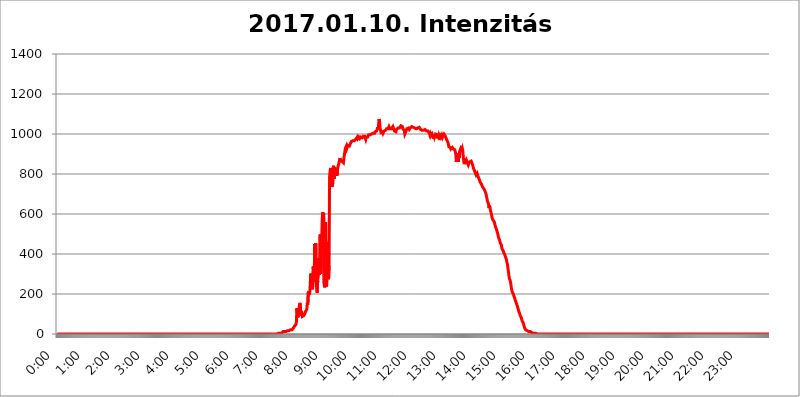
| Category | 2017.01.10. Intenzitás [W/m^2] |
|---|---|
| 0.0 | 0 |
| 0.0006944444444444445 | 0 |
| 0.001388888888888889 | 0 |
| 0.0020833333333333333 | 0 |
| 0.002777777777777778 | 0 |
| 0.003472222222222222 | 0 |
| 0.004166666666666667 | 0 |
| 0.004861111111111111 | 0 |
| 0.005555555555555556 | 0 |
| 0.0062499999999999995 | 0 |
| 0.006944444444444444 | 0 |
| 0.007638888888888889 | 0 |
| 0.008333333333333333 | 0 |
| 0.009027777777777779 | 0 |
| 0.009722222222222222 | 0 |
| 0.010416666666666666 | 0 |
| 0.011111111111111112 | 0 |
| 0.011805555555555555 | 0 |
| 0.012499999999999999 | 0 |
| 0.013194444444444444 | 0 |
| 0.013888888888888888 | 0 |
| 0.014583333333333332 | 0 |
| 0.015277777777777777 | 0 |
| 0.015972222222222224 | 0 |
| 0.016666666666666666 | 0 |
| 0.017361111111111112 | 0 |
| 0.018055555555555557 | 0 |
| 0.01875 | 0 |
| 0.019444444444444445 | 0 |
| 0.02013888888888889 | 0 |
| 0.020833333333333332 | 0 |
| 0.02152777777777778 | 0 |
| 0.022222222222222223 | 0 |
| 0.02291666666666667 | 0 |
| 0.02361111111111111 | 0 |
| 0.024305555555555556 | 0 |
| 0.024999999999999998 | 0 |
| 0.025694444444444447 | 0 |
| 0.02638888888888889 | 0 |
| 0.027083333333333334 | 0 |
| 0.027777777777777776 | 0 |
| 0.02847222222222222 | 0 |
| 0.029166666666666664 | 0 |
| 0.029861111111111113 | 0 |
| 0.030555555555555555 | 0 |
| 0.03125 | 0 |
| 0.03194444444444445 | 0 |
| 0.03263888888888889 | 0 |
| 0.03333333333333333 | 0 |
| 0.034027777777777775 | 0 |
| 0.034722222222222224 | 0 |
| 0.035416666666666666 | 0 |
| 0.036111111111111115 | 0 |
| 0.03680555555555556 | 0 |
| 0.0375 | 0 |
| 0.03819444444444444 | 0 |
| 0.03888888888888889 | 0 |
| 0.03958333333333333 | 0 |
| 0.04027777777777778 | 0 |
| 0.04097222222222222 | 0 |
| 0.041666666666666664 | 0 |
| 0.042361111111111106 | 0 |
| 0.04305555555555556 | 0 |
| 0.043750000000000004 | 0 |
| 0.044444444444444446 | 0 |
| 0.04513888888888889 | 0 |
| 0.04583333333333334 | 0 |
| 0.04652777777777778 | 0 |
| 0.04722222222222222 | 0 |
| 0.04791666666666666 | 0 |
| 0.04861111111111111 | 0 |
| 0.049305555555555554 | 0 |
| 0.049999999999999996 | 0 |
| 0.05069444444444445 | 0 |
| 0.051388888888888894 | 0 |
| 0.052083333333333336 | 0 |
| 0.05277777777777778 | 0 |
| 0.05347222222222222 | 0 |
| 0.05416666666666667 | 0 |
| 0.05486111111111111 | 0 |
| 0.05555555555555555 | 0 |
| 0.05625 | 0 |
| 0.05694444444444444 | 0 |
| 0.057638888888888885 | 0 |
| 0.05833333333333333 | 0 |
| 0.05902777777777778 | 0 |
| 0.059722222222222225 | 0 |
| 0.06041666666666667 | 0 |
| 0.061111111111111116 | 0 |
| 0.06180555555555556 | 0 |
| 0.0625 | 0 |
| 0.06319444444444444 | 0 |
| 0.06388888888888888 | 0 |
| 0.06458333333333334 | 0 |
| 0.06527777777777778 | 0 |
| 0.06597222222222222 | 0 |
| 0.06666666666666667 | 0 |
| 0.06736111111111111 | 0 |
| 0.06805555555555555 | 0 |
| 0.06874999999999999 | 0 |
| 0.06944444444444443 | 0 |
| 0.07013888888888889 | 0 |
| 0.07083333333333333 | 0 |
| 0.07152777777777779 | 0 |
| 0.07222222222222223 | 0 |
| 0.07291666666666667 | 0 |
| 0.07361111111111111 | 0 |
| 0.07430555555555556 | 0 |
| 0.075 | 0 |
| 0.07569444444444444 | 0 |
| 0.0763888888888889 | 0 |
| 0.07708333333333334 | 0 |
| 0.07777777777777778 | 0 |
| 0.07847222222222222 | 0 |
| 0.07916666666666666 | 0 |
| 0.0798611111111111 | 0 |
| 0.08055555555555556 | 0 |
| 0.08125 | 0 |
| 0.08194444444444444 | 0 |
| 0.08263888888888889 | 0 |
| 0.08333333333333333 | 0 |
| 0.08402777777777777 | 0 |
| 0.08472222222222221 | 0 |
| 0.08541666666666665 | 0 |
| 0.08611111111111112 | 0 |
| 0.08680555555555557 | 0 |
| 0.08750000000000001 | 0 |
| 0.08819444444444445 | 0 |
| 0.08888888888888889 | 0 |
| 0.08958333333333333 | 0 |
| 0.09027777777777778 | 0 |
| 0.09097222222222222 | 0 |
| 0.09166666666666667 | 0 |
| 0.09236111111111112 | 0 |
| 0.09305555555555556 | 0 |
| 0.09375 | 0 |
| 0.09444444444444444 | 0 |
| 0.09513888888888888 | 0 |
| 0.09583333333333333 | 0 |
| 0.09652777777777777 | 0 |
| 0.09722222222222222 | 0 |
| 0.09791666666666667 | 0 |
| 0.09861111111111111 | 0 |
| 0.09930555555555555 | 0 |
| 0.09999999999999999 | 0 |
| 0.10069444444444443 | 0 |
| 0.1013888888888889 | 0 |
| 0.10208333333333335 | 0 |
| 0.10277777777777779 | 0 |
| 0.10347222222222223 | 0 |
| 0.10416666666666667 | 0 |
| 0.10486111111111111 | 0 |
| 0.10555555555555556 | 0 |
| 0.10625 | 0 |
| 0.10694444444444444 | 0 |
| 0.1076388888888889 | 0 |
| 0.10833333333333334 | 0 |
| 0.10902777777777778 | 0 |
| 0.10972222222222222 | 0 |
| 0.1111111111111111 | 0 |
| 0.11180555555555556 | 0 |
| 0.11180555555555556 | 0 |
| 0.1125 | 0 |
| 0.11319444444444444 | 0 |
| 0.11388888888888889 | 0 |
| 0.11458333333333333 | 0 |
| 0.11527777777777777 | 0 |
| 0.11597222222222221 | 0 |
| 0.11666666666666665 | 0 |
| 0.1173611111111111 | 0 |
| 0.11805555555555557 | 0 |
| 0.11944444444444445 | 0 |
| 0.12013888888888889 | 0 |
| 0.12083333333333333 | 0 |
| 0.12152777777777778 | 0 |
| 0.12222222222222223 | 0 |
| 0.12291666666666667 | 0 |
| 0.12291666666666667 | 0 |
| 0.12361111111111112 | 0 |
| 0.12430555555555556 | 0 |
| 0.125 | 0 |
| 0.12569444444444444 | 0 |
| 0.12638888888888888 | 0 |
| 0.12708333333333333 | 0 |
| 0.16875 | 0 |
| 0.12847222222222224 | 0 |
| 0.12916666666666668 | 0 |
| 0.12986111111111112 | 0 |
| 0.13055555555555556 | 0 |
| 0.13125 | 0 |
| 0.13194444444444445 | 0 |
| 0.1326388888888889 | 0 |
| 0.13333333333333333 | 0 |
| 0.13402777777777777 | 0 |
| 0.13402777777777777 | 0 |
| 0.13472222222222222 | 0 |
| 0.13541666666666666 | 0 |
| 0.1361111111111111 | 0 |
| 0.13749999999999998 | 0 |
| 0.13819444444444443 | 0 |
| 0.1388888888888889 | 0 |
| 0.13958333333333334 | 0 |
| 0.14027777777777778 | 0 |
| 0.14097222222222222 | 0 |
| 0.14166666666666666 | 0 |
| 0.1423611111111111 | 0 |
| 0.14305555555555557 | 0 |
| 0.14375000000000002 | 0 |
| 0.14444444444444446 | 0 |
| 0.1451388888888889 | 0 |
| 0.1451388888888889 | 0 |
| 0.14652777777777778 | 0 |
| 0.14722222222222223 | 0 |
| 0.14791666666666667 | 0 |
| 0.1486111111111111 | 0 |
| 0.14930555555555555 | 0 |
| 0.15 | 0 |
| 0.15069444444444444 | 0 |
| 0.15138888888888888 | 0 |
| 0.15208333333333332 | 0 |
| 0.15277777777777776 | 0 |
| 0.15347222222222223 | 0 |
| 0.15416666666666667 | 0 |
| 0.15486111111111112 | 0 |
| 0.15555555555555556 | 0 |
| 0.15625 | 0 |
| 0.15694444444444444 | 0 |
| 0.15763888888888888 | 0 |
| 0.15833333333333333 | 0 |
| 0.15902777777777777 | 0 |
| 0.15972222222222224 | 0 |
| 0.16041666666666668 | 0 |
| 0.16111111111111112 | 0 |
| 0.16180555555555556 | 0 |
| 0.1625 | 0 |
| 0.16319444444444445 | 0 |
| 0.1638888888888889 | 0 |
| 0.16458333333333333 | 0 |
| 0.16527777777777777 | 0 |
| 0.16597222222222222 | 0 |
| 0.16666666666666666 | 0 |
| 0.1673611111111111 | 0 |
| 0.16805555555555554 | 0 |
| 0.16874999999999998 | 0 |
| 0.16944444444444443 | 0 |
| 0.17013888888888887 | 0 |
| 0.1708333333333333 | 0 |
| 0.17152777777777775 | 0 |
| 0.17222222222222225 | 0 |
| 0.1729166666666667 | 0 |
| 0.17361111111111113 | 0 |
| 0.17430555555555557 | 0 |
| 0.17500000000000002 | 0 |
| 0.17569444444444446 | 0 |
| 0.1763888888888889 | 0 |
| 0.17708333333333334 | 0 |
| 0.17777777777777778 | 0 |
| 0.17847222222222223 | 0 |
| 0.17916666666666667 | 0 |
| 0.1798611111111111 | 0 |
| 0.18055555555555555 | 0 |
| 0.18125 | 0 |
| 0.18194444444444444 | 0 |
| 0.1826388888888889 | 0 |
| 0.18333333333333335 | 0 |
| 0.1840277777777778 | 0 |
| 0.18472222222222223 | 0 |
| 0.18541666666666667 | 0 |
| 0.18611111111111112 | 0 |
| 0.18680555555555556 | 0 |
| 0.1875 | 0 |
| 0.18819444444444444 | 0 |
| 0.18888888888888888 | 0 |
| 0.18958333333333333 | 0 |
| 0.19027777777777777 | 0 |
| 0.1909722222222222 | 0 |
| 0.19166666666666665 | 0 |
| 0.19236111111111112 | 0 |
| 0.19305555555555554 | 0 |
| 0.19375 | 0 |
| 0.19444444444444445 | 0 |
| 0.1951388888888889 | 0 |
| 0.19583333333333333 | 0 |
| 0.19652777777777777 | 0 |
| 0.19722222222222222 | 0 |
| 0.19791666666666666 | 0 |
| 0.1986111111111111 | 0 |
| 0.19930555555555554 | 0 |
| 0.19999999999999998 | 0 |
| 0.20069444444444443 | 0 |
| 0.20138888888888887 | 0 |
| 0.2020833333333333 | 0 |
| 0.2027777777777778 | 0 |
| 0.2034722222222222 | 0 |
| 0.2041666666666667 | 0 |
| 0.20486111111111113 | 0 |
| 0.20555555555555557 | 0 |
| 0.20625000000000002 | 0 |
| 0.20694444444444446 | 0 |
| 0.2076388888888889 | 0 |
| 0.20833333333333334 | 0 |
| 0.20902777777777778 | 0 |
| 0.20972222222222223 | 0 |
| 0.21041666666666667 | 0 |
| 0.2111111111111111 | 0 |
| 0.21180555555555555 | 0 |
| 0.2125 | 0 |
| 0.21319444444444444 | 0 |
| 0.2138888888888889 | 0 |
| 0.21458333333333335 | 0 |
| 0.2152777777777778 | 0 |
| 0.21597222222222223 | 0 |
| 0.21666666666666667 | 0 |
| 0.21736111111111112 | 0 |
| 0.21805555555555556 | 0 |
| 0.21875 | 0 |
| 0.21944444444444444 | 0 |
| 0.22013888888888888 | 0 |
| 0.22083333333333333 | 0 |
| 0.22152777777777777 | 0 |
| 0.2222222222222222 | 0 |
| 0.22291666666666665 | 0 |
| 0.2236111111111111 | 0 |
| 0.22430555555555556 | 0 |
| 0.225 | 0 |
| 0.22569444444444445 | 0 |
| 0.2263888888888889 | 0 |
| 0.22708333333333333 | 0 |
| 0.22777777777777777 | 0 |
| 0.22847222222222222 | 0 |
| 0.22916666666666666 | 0 |
| 0.2298611111111111 | 0 |
| 0.23055555555555554 | 0 |
| 0.23124999999999998 | 0 |
| 0.23194444444444443 | 0 |
| 0.23263888888888887 | 0 |
| 0.2333333333333333 | 0 |
| 0.2340277777777778 | 0 |
| 0.2347222222222222 | 0 |
| 0.2354166666666667 | 0 |
| 0.23611111111111113 | 0 |
| 0.23680555555555557 | 0 |
| 0.23750000000000002 | 0 |
| 0.23819444444444446 | 0 |
| 0.2388888888888889 | 0 |
| 0.23958333333333334 | 0 |
| 0.24027777777777778 | 0 |
| 0.24097222222222223 | 0 |
| 0.24166666666666667 | 0 |
| 0.2423611111111111 | 0 |
| 0.24305555555555555 | 0 |
| 0.24375 | 0 |
| 0.24444444444444446 | 0 |
| 0.24513888888888888 | 0 |
| 0.24583333333333335 | 0 |
| 0.2465277777777778 | 0 |
| 0.24722222222222223 | 0 |
| 0.24791666666666667 | 0 |
| 0.24861111111111112 | 0 |
| 0.24930555555555556 | 0 |
| 0.25 | 0 |
| 0.25069444444444444 | 0 |
| 0.2513888888888889 | 0 |
| 0.2520833333333333 | 0 |
| 0.25277777777777777 | 0 |
| 0.2534722222222222 | 0 |
| 0.25416666666666665 | 0 |
| 0.2548611111111111 | 0 |
| 0.2555555555555556 | 0 |
| 0.25625000000000003 | 0 |
| 0.2569444444444445 | 0 |
| 0.2576388888888889 | 0 |
| 0.25833333333333336 | 0 |
| 0.2590277777777778 | 0 |
| 0.25972222222222224 | 0 |
| 0.2604166666666667 | 0 |
| 0.2611111111111111 | 0 |
| 0.26180555555555557 | 0 |
| 0.2625 | 0 |
| 0.26319444444444445 | 0 |
| 0.2638888888888889 | 0 |
| 0.26458333333333334 | 0 |
| 0.2652777777777778 | 0 |
| 0.2659722222222222 | 0 |
| 0.26666666666666666 | 0 |
| 0.2673611111111111 | 0 |
| 0.26805555555555555 | 0 |
| 0.26875 | 0 |
| 0.26944444444444443 | 0 |
| 0.2701388888888889 | 0 |
| 0.2708333333333333 | 0 |
| 0.27152777777777776 | 0 |
| 0.2722222222222222 | 0 |
| 0.27291666666666664 | 0 |
| 0.2736111111111111 | 0 |
| 0.2743055555555555 | 0 |
| 0.27499999999999997 | 0 |
| 0.27569444444444446 | 0 |
| 0.27638888888888885 | 0 |
| 0.27708333333333335 | 0 |
| 0.2777777777777778 | 0 |
| 0.27847222222222223 | 0 |
| 0.2791666666666667 | 0 |
| 0.2798611111111111 | 0 |
| 0.28055555555555556 | 0 |
| 0.28125 | 0 |
| 0.28194444444444444 | 0 |
| 0.2826388888888889 | 0 |
| 0.2833333333333333 | 0 |
| 0.28402777777777777 | 0 |
| 0.2847222222222222 | 0 |
| 0.28541666666666665 | 0 |
| 0.28611111111111115 | 0 |
| 0.28680555555555554 | 0 |
| 0.28750000000000003 | 0 |
| 0.2881944444444445 | 0 |
| 0.2888888888888889 | 0 |
| 0.28958333333333336 | 0 |
| 0.2902777777777778 | 0 |
| 0.29097222222222224 | 0 |
| 0.2916666666666667 | 0 |
| 0.2923611111111111 | 0 |
| 0.29305555555555557 | 0 |
| 0.29375 | 0 |
| 0.29444444444444445 | 0 |
| 0.2951388888888889 | 0 |
| 0.29583333333333334 | 0 |
| 0.2965277777777778 | 0 |
| 0.2972222222222222 | 0 |
| 0.29791666666666666 | 0 |
| 0.2986111111111111 | 0 |
| 0.29930555555555555 | 0 |
| 0.3 | 0 |
| 0.30069444444444443 | 0 |
| 0.3013888888888889 | 0 |
| 0.3020833333333333 | 0 |
| 0.30277777777777776 | 0 |
| 0.3034722222222222 | 0 |
| 0.30416666666666664 | 0 |
| 0.3048611111111111 | 0 |
| 0.3055555555555555 | 0 |
| 0.30624999999999997 | 0 |
| 0.3069444444444444 | 0 |
| 0.3076388888888889 | 0 |
| 0.30833333333333335 | 0 |
| 0.3090277777777778 | 0 |
| 0.30972222222222223 | 3.525 |
| 0.3104166666666667 | 3.525 |
| 0.3111111111111111 | 3.525 |
| 0.31180555555555556 | 3.525 |
| 0.3125 | 3.525 |
| 0.31319444444444444 | 3.525 |
| 0.3138888888888889 | 3.525 |
| 0.3145833333333333 | 3.525 |
| 0.31527777777777777 | 7.887 |
| 0.3159722222222222 | 7.887 |
| 0.31666666666666665 | 12.257 |
| 0.31736111111111115 | 12.257 |
| 0.31805555555555554 | 12.257 |
| 0.31875000000000003 | 12.257 |
| 0.3194444444444445 | 12.257 |
| 0.3201388888888889 | 12.257 |
| 0.32083333333333336 | 12.257 |
| 0.3215277777777778 | 12.257 |
| 0.32222222222222224 | 12.257 |
| 0.3229166666666667 | 16.636 |
| 0.3236111111111111 | 16.636 |
| 0.32430555555555557 | 16.636 |
| 0.325 | 16.636 |
| 0.32569444444444445 | 16.636 |
| 0.3263888888888889 | 21.024 |
| 0.32708333333333334 | 21.024 |
| 0.3277777777777778 | 21.024 |
| 0.3284722222222222 | 21.024 |
| 0.32916666666666666 | 21.024 |
| 0.3298611111111111 | 25.419 |
| 0.33055555555555555 | 25.419 |
| 0.33125 | 29.823 |
| 0.33194444444444443 | 34.234 |
| 0.3326388888888889 | 38.653 |
| 0.3333333333333333 | 38.653 |
| 0.3340277777777778 | 38.653 |
| 0.3347222222222222 | 47.511 |
| 0.3354166666666667 | 60.85 |
| 0.3361111111111111 | 128.284 |
| 0.3368055555555556 | 105.69 |
| 0.33749999999999997 | 83.205 |
| 0.33819444444444446 | 96.682 |
| 0.33888888888888885 | 110.201 |
| 0.33958333333333335 | 141.884 |
| 0.34027777777777773 | 155.509 |
| 0.34097222222222223 | 141.884 |
| 0.3416666666666666 | 92.184 |
| 0.3423611111111111 | 114.716 |
| 0.3430555555555555 | 105.69 |
| 0.34375 | 87.692 |
| 0.3444444444444445 | 83.205 |
| 0.3451388888888889 | 87.692 |
| 0.3458333333333334 | 92.184 |
| 0.34652777777777777 | 96.682 |
| 0.34722222222222227 | 101.184 |
| 0.34791666666666665 | 105.69 |
| 0.34861111111111115 | 114.716 |
| 0.34930555555555554 | 119.235 |
| 0.35000000000000003 | 123.758 |
| 0.3506944444444444 | 155.509 |
| 0.3513888888888889 | 146.423 |
| 0.3520833333333333 | 205.62 |
| 0.3527777777777778 | 214.746 |
| 0.3534722222222222 | 196.497 |
| 0.3541666666666667 | 205.62 |
| 0.3548611111111111 | 210.182 |
| 0.35555555555555557 | 301.354 |
| 0.35625 | 246.689 |
| 0.35694444444444445 | 301.354 |
| 0.3576388888888889 | 223.873 |
| 0.35833333333333334 | 237.564 |
| 0.3590277777777778 | 337.639 |
| 0.3597222222222222 | 287.709 |
| 0.36041666666666666 | 260.373 |
| 0.3611111111111111 | 449.551 |
| 0.36180555555555555 | 292.259 |
| 0.3625 | 453.968 |
| 0.36319444444444443 | 251.251 |
| 0.3638888888888889 | 228.436 |
| 0.3645833333333333 | 205.62 |
| 0.3652777777777778 | 264.932 |
| 0.3659722222222222 | 287.709 |
| 0.3666666666666667 | 378.224 |
| 0.3673611111111111 | 296.808 |
| 0.3680555555555556 | 369.23 |
| 0.36874999999999997 | 497.836 |
| 0.36944444444444446 | 301.354 |
| 0.37013888888888885 | 378.224 |
| 0.37083333333333335 | 453.968 |
| 0.37152777777777773 | 562.53 |
| 0.37222222222222223 | 609.062 |
| 0.3729166666666666 | 592.233 |
| 0.3736111111111111 | 604.864 |
| 0.3743055555555555 | 251.251 |
| 0.375 | 233 |
| 0.3756944444444445 | 251.251 |
| 0.3763888888888889 | 558.261 |
| 0.3770833333333334 | 278.603 |
| 0.37777777777777777 | 237.564 |
| 0.37847222222222227 | 242.127 |
| 0.37916666666666665 | 458.38 |
| 0.37986111111111115 | 405.108 |
| 0.38055555555555554 | 274.047 |
| 0.38125000000000003 | 342.162 |
| 0.3819444444444444 | 783.342 |
| 0.3826388888888889 | 814.519 |
| 0.3833333333333333 | 829.981 |
| 0.3840277777777778 | 818.392 |
| 0.3847222222222222 | 806.757 |
| 0.3854166666666667 | 795.074 |
| 0.3861111111111111 | 735.89 |
| 0.38680555555555557 | 822.26 |
| 0.3875 | 841.526 |
| 0.38819444444444445 | 775.492 |
| 0.3888888888888889 | 806.757 |
| 0.38958333333333334 | 814.519 |
| 0.3902777777777778 | 822.26 |
| 0.3909722222222222 | 826.123 |
| 0.39166666666666666 | 814.519 |
| 0.3923611111111111 | 791.169 |
| 0.39305555555555555 | 822.26 |
| 0.39375 | 837.682 |
| 0.39444444444444443 | 845.365 |
| 0.3951388888888889 | 845.365 |
| 0.3958333333333333 | 868.305 |
| 0.3965277777777778 | 879.719 |
| 0.3972222222222222 | 864.493 |
| 0.3979166666666667 | 860.676 |
| 0.3986111111111111 | 868.305 |
| 0.3993055555555556 | 864.493 |
| 0.39999999999999997 | 860.676 |
| 0.40069444444444446 | 864.493 |
| 0.40138888888888885 | 856.855 |
| 0.40208333333333335 | 879.719 |
| 0.40277777777777773 | 898.668 |
| 0.40347222222222223 | 913.766 |
| 0.4041666666666666 | 928.819 |
| 0.4048611111111111 | 932.576 |
| 0.4055555555555555 | 940.082 |
| 0.40625 | 928.819 |
| 0.4069444444444445 | 928.819 |
| 0.4076388888888889 | 943.832 |
| 0.4083333333333334 | 947.58 |
| 0.40902777777777777 | 940.082 |
| 0.40972222222222227 | 940.082 |
| 0.41041666666666665 | 940.082 |
| 0.41111111111111115 | 951.327 |
| 0.41180555555555554 | 951.327 |
| 0.41250000000000003 | 962.555 |
| 0.4131944444444444 | 962.555 |
| 0.4138888888888889 | 966.295 |
| 0.4145833333333333 | 966.295 |
| 0.4152777777777778 | 962.555 |
| 0.4159722222222222 | 962.555 |
| 0.4166666666666667 | 966.295 |
| 0.4173611111111111 | 970.034 |
| 0.41805555555555557 | 970.034 |
| 0.41875 | 973.772 |
| 0.41944444444444445 | 973.772 |
| 0.4201388888888889 | 977.508 |
| 0.42083333333333334 | 984.98 |
| 0.4215277777777778 | 977.508 |
| 0.4222222222222222 | 981.244 |
| 0.42291666666666666 | 984.98 |
| 0.4236111111111111 | 981.244 |
| 0.42430555555555555 | 977.508 |
| 0.425 | 981.244 |
| 0.42569444444444443 | 984.98 |
| 0.4263888888888889 | 984.98 |
| 0.4270833333333333 | 981.244 |
| 0.4277777777777778 | 981.244 |
| 0.4284722222222222 | 984.98 |
| 0.4291666666666667 | 988.714 |
| 0.4298611111111111 | 984.98 |
| 0.4305555555555556 | 984.98 |
| 0.43124999999999997 | 988.714 |
| 0.43194444444444446 | 984.98 |
| 0.43263888888888885 | 973.772 |
| 0.43333333333333335 | 984.98 |
| 0.43402777777777773 | 988.714 |
| 0.43472222222222223 | 984.98 |
| 0.4354166666666666 | 984.98 |
| 0.4361111111111111 | 988.714 |
| 0.4368055555555555 | 996.182 |
| 0.4375 | 992.448 |
| 0.4381944444444445 | 999.916 |
| 0.4388888888888889 | 996.182 |
| 0.4395833333333334 | 996.182 |
| 0.44027777777777777 | 999.916 |
| 0.44097222222222227 | 999.916 |
| 0.44166666666666665 | 999.916 |
| 0.44236111111111115 | 999.916 |
| 0.44305555555555554 | 1003.65 |
| 0.44375000000000003 | 1007.383 |
| 0.4444444444444444 | 1007.383 |
| 0.4451388888888889 | 1003.65 |
| 0.4458333333333333 | 1011.118 |
| 0.4465277777777778 | 1014.852 |
| 0.4472222222222222 | 1007.383 |
| 0.4479166666666667 | 1014.852 |
| 0.4486111111111111 | 1022.323 |
| 0.44930555555555557 | 1033.537 |
| 0.45 | 1022.323 |
| 0.45069444444444445 | 1044.762 |
| 0.4513888888888889 | 1074.789 |
| 0.45208333333333334 | 1059.756 |
| 0.4527777777777778 | 1029.798 |
| 0.4534722222222222 | 1018.587 |
| 0.45416666666666666 | 1007.383 |
| 0.4548611111111111 | 1007.383 |
| 0.45555555555555555 | 1007.383 |
| 0.45625 | 1011.118 |
| 0.45694444444444443 | 1003.65 |
| 0.4576388888888889 | 1007.383 |
| 0.4583333333333333 | 1014.852 |
| 0.4590277777777778 | 1014.852 |
| 0.4597222222222222 | 1014.852 |
| 0.4604166666666667 | 1018.587 |
| 0.4611111111111111 | 1022.323 |
| 0.4618055555555556 | 1026.06 |
| 0.46249999999999997 | 1022.323 |
| 0.46319444444444446 | 1022.323 |
| 0.46388888888888885 | 1026.06 |
| 0.46458333333333335 | 1029.798 |
| 0.46527777777777773 | 1037.277 |
| 0.46597222222222223 | 1033.537 |
| 0.4666666666666666 | 1026.06 |
| 0.4673611111111111 | 1026.06 |
| 0.4680555555555555 | 1026.06 |
| 0.46875 | 1026.06 |
| 0.4694444444444445 | 1026.06 |
| 0.4701388888888889 | 1029.798 |
| 0.4708333333333334 | 1037.277 |
| 0.47152777777777777 | 1037.277 |
| 0.47222222222222227 | 1022.323 |
| 0.47291666666666665 | 1014.852 |
| 0.47361111111111115 | 1014.852 |
| 0.47430555555555554 | 1014.852 |
| 0.47500000000000003 | 1011.118 |
| 0.4756944444444444 | 1022.323 |
| 0.4763888888888889 | 1022.323 |
| 0.4770833333333333 | 1022.323 |
| 0.4777777777777778 | 1029.798 |
| 0.4784722222222222 | 1029.798 |
| 0.4791666666666667 | 1026.06 |
| 0.4798611111111111 | 1029.798 |
| 0.48055555555555557 | 1026.06 |
| 0.48125 | 1033.537 |
| 0.48194444444444445 | 1041.019 |
| 0.4826388888888889 | 1041.019 |
| 0.48333333333333334 | 1037.277 |
| 0.4840277777777778 | 1037.277 |
| 0.4847222222222222 | 1026.06 |
| 0.48541666666666666 | 1022.323 |
| 0.4861111111111111 | 1026.06 |
| 0.48680555555555555 | 1018.587 |
| 0.4875 | 999.916 |
| 0.48819444444444443 | 999.916 |
| 0.4888888888888889 | 1011.118 |
| 0.4895833333333333 | 1014.852 |
| 0.4902777777777778 | 1026.06 |
| 0.4909722222222222 | 1022.323 |
| 0.4916666666666667 | 1022.323 |
| 0.4923611111111111 | 1029.798 |
| 0.4930555555555556 | 1029.798 |
| 0.49374999999999997 | 1022.323 |
| 0.49444444444444446 | 1026.06 |
| 0.49513888888888885 | 1029.798 |
| 0.49583333333333335 | 1033.537 |
| 0.49652777777777773 | 1033.537 |
| 0.49722222222222223 | 1037.277 |
| 0.4979166666666666 | 1033.537 |
| 0.4986111111111111 | 1037.277 |
| 0.4993055555555555 | 1033.537 |
| 0.5 | 1037.277 |
| 0.5006944444444444 | 1029.798 |
| 0.5013888888888889 | 1029.798 |
| 0.5020833333333333 | 1029.798 |
| 0.5027777777777778 | 1029.798 |
| 0.5034722222222222 | 1026.06 |
| 0.5041666666666667 | 1022.323 |
| 0.5048611111111111 | 1022.323 |
| 0.5055555555555555 | 1029.798 |
| 0.50625 | 1033.537 |
| 0.5069444444444444 | 1033.537 |
| 0.5076388888888889 | 1033.537 |
| 0.5083333333333333 | 1029.798 |
| 0.5090277777777777 | 1029.798 |
| 0.5097222222222222 | 1022.323 |
| 0.5104166666666666 | 1022.323 |
| 0.5111111111111112 | 1018.587 |
| 0.5118055555555555 | 1018.587 |
| 0.5125000000000001 | 1014.852 |
| 0.5131944444444444 | 1022.323 |
| 0.513888888888889 | 1018.587 |
| 0.5145833333333333 | 1014.852 |
| 0.5152777777777778 | 1022.323 |
| 0.5159722222222222 | 1022.323 |
| 0.5166666666666667 | 1022.323 |
| 0.517361111111111 | 1018.587 |
| 0.5180555555555556 | 1014.852 |
| 0.5187499999999999 | 1014.852 |
| 0.5194444444444445 | 1011.118 |
| 0.5201388888888888 | 1014.852 |
| 0.5208333333333334 | 1018.587 |
| 0.5215277777777778 | 1011.118 |
| 0.5222222222222223 | 999.916 |
| 0.5229166666666667 | 992.448 |
| 0.5236111111111111 | 999.916 |
| 0.5243055555555556 | 992.448 |
| 0.525 | 988.714 |
| 0.5256944444444445 | 999.916 |
| 0.5263888888888889 | 992.448 |
| 0.5270833333333333 | 992.448 |
| 0.5277777777777778 | 977.508 |
| 0.5284722222222222 | 996.182 |
| 0.5291666666666667 | 984.98 |
| 0.5298611111111111 | 984.98 |
| 0.5305555555555556 | 999.916 |
| 0.53125 | 1003.65 |
| 0.5319444444444444 | 1003.65 |
| 0.5326388888888889 | 996.182 |
| 0.5333333333333333 | 977.508 |
| 0.5340277777777778 | 984.98 |
| 0.5347222222222222 | 992.448 |
| 0.5354166666666667 | 981.244 |
| 0.5361111111111111 | 970.034 |
| 0.5368055555555555 | 973.772 |
| 0.5375 | 992.448 |
| 0.5381944444444444 | 992.448 |
| 0.5388888888888889 | 984.98 |
| 0.5395833333333333 | 992.448 |
| 0.5402777777777777 | 984.98 |
| 0.5409722222222222 | 992.448 |
| 0.5416666666666666 | 996.182 |
| 0.5423611111111112 | 999.916 |
| 0.5430555555555555 | 996.182 |
| 0.5437500000000001 | 992.448 |
| 0.5444444444444444 | 992.448 |
| 0.545138888888889 | 981.244 |
| 0.5458333333333333 | 973.772 |
| 0.5465277777777778 | 977.508 |
| 0.5472222222222222 | 970.034 |
| 0.5479166666666667 | 958.814 |
| 0.548611111111111 | 947.58 |
| 0.5493055555555556 | 936.33 |
| 0.5499999999999999 | 940.082 |
| 0.5506944444444445 | 936.33 |
| 0.5513888888888888 | 932.576 |
| 0.5520833333333334 | 925.06 |
| 0.5527777777777778 | 928.819 |
| 0.5534722222222223 | 928.819 |
| 0.5541666666666667 | 932.576 |
| 0.5548611111111111 | 932.576 |
| 0.5555555555555556 | 925.06 |
| 0.55625 | 921.298 |
| 0.5569444444444445 | 921.298 |
| 0.5576388888888889 | 921.298 |
| 0.5583333333333333 | 909.996 |
| 0.5590277777777778 | 898.668 |
| 0.5597222222222222 | 860.676 |
| 0.5604166666666667 | 902.447 |
| 0.5611111111111111 | 887.309 |
| 0.5618055555555556 | 879.719 |
| 0.5625 | 860.676 |
| 0.5631944444444444 | 902.447 |
| 0.5638888888888889 | 879.719 |
| 0.5645833333333333 | 913.766 |
| 0.5652777777777778 | 917.534 |
| 0.5659722222222222 | 928.819 |
| 0.5666666666666667 | 928.819 |
| 0.5673611111111111 | 921.298 |
| 0.5680555555555555 | 928.819 |
| 0.56875 | 917.534 |
| 0.5694444444444444 | 887.309 |
| 0.5701388888888889 | 864.493 |
| 0.5708333333333333 | 849.199 |
| 0.5715277777777777 | 860.676 |
| 0.5722222222222222 | 856.855 |
| 0.5729166666666666 | 860.676 |
| 0.5736111111111112 | 872.114 |
| 0.5743055555555555 | 872.114 |
| 0.5750000000000001 | 856.855 |
| 0.5756944444444444 | 856.855 |
| 0.576388888888889 | 845.365 |
| 0.5770833333333333 | 853.029 |
| 0.5777777777777778 | 849.199 |
| 0.5784722222222222 | 860.676 |
| 0.5791666666666667 | 860.676 |
| 0.579861111111111 | 860.676 |
| 0.5805555555555556 | 864.493 |
| 0.5812499999999999 | 868.305 |
| 0.5819444444444445 | 860.676 |
| 0.5826388888888888 | 845.365 |
| 0.5833333333333334 | 833.834 |
| 0.5840277777777778 | 826.123 |
| 0.5847222222222223 | 822.26 |
| 0.5854166666666667 | 814.519 |
| 0.5861111111111111 | 806.757 |
| 0.5868055555555556 | 802.868 |
| 0.5875 | 795.074 |
| 0.5881944444444445 | 795.074 |
| 0.5888888888888889 | 802.868 |
| 0.5895833333333333 | 798.974 |
| 0.5902777777777778 | 787.258 |
| 0.5909722222222222 | 783.342 |
| 0.5916666666666667 | 775.492 |
| 0.5923611111111111 | 767.62 |
| 0.5930555555555556 | 759.723 |
| 0.59375 | 763.674 |
| 0.5944444444444444 | 755.766 |
| 0.5951388888888889 | 747.834 |
| 0.5958333333333333 | 739.877 |
| 0.5965277777777778 | 735.89 |
| 0.5972222222222222 | 731.896 |
| 0.5979166666666667 | 731.896 |
| 0.5986111111111111 | 727.896 |
| 0.5993055555555555 | 719.877 |
| 0.6 | 715.858 |
| 0.6006944444444444 | 707.8 |
| 0.6013888888888889 | 699.717 |
| 0.6020833333333333 | 687.544 |
| 0.6027777777777777 | 675.311 |
| 0.6034722222222222 | 663.019 |
| 0.6041666666666666 | 658.909 |
| 0.6048611111111112 | 650.667 |
| 0.6055555555555555 | 629.948 |
| 0.6062500000000001 | 642.4 |
| 0.6069444444444444 | 629.948 |
| 0.607638888888889 | 617.436 |
| 0.6083333333333333 | 609.062 |
| 0.6090277777777778 | 596.45 |
| 0.6097222222222222 | 583.779 |
| 0.6104166666666667 | 575.299 |
| 0.611111111111111 | 579.542 |
| 0.6118055555555556 | 566.793 |
| 0.6124999999999999 | 562.53 |
| 0.6131944444444445 | 558.261 |
| 0.6138888888888888 | 545.416 |
| 0.6145833333333334 | 536.82 |
| 0.6152777777777778 | 536.82 |
| 0.6159722222222223 | 523.88 |
| 0.6166666666666667 | 515.223 |
| 0.6173611111111111 | 506.542 |
| 0.6180555555555556 | 497.836 |
| 0.61875 | 484.735 |
| 0.6194444444444445 | 480.356 |
| 0.6201388888888889 | 471.582 |
| 0.6208333333333333 | 467.187 |
| 0.6215277777777778 | 453.968 |
| 0.6222222222222222 | 449.551 |
| 0.6229166666666667 | 445.129 |
| 0.6236111111111111 | 427.39 |
| 0.6243055555555556 | 422.943 |
| 0.625 | 422.943 |
| 0.6256944444444444 | 414.035 |
| 0.6263888888888889 | 405.108 |
| 0.6270833333333333 | 400.638 |
| 0.6277777777777778 | 396.164 |
| 0.6284722222222222 | 387.202 |
| 0.6291666666666667 | 387.202 |
| 0.6298611111111111 | 373.729 |
| 0.6305555555555555 | 360.221 |
| 0.63125 | 351.198 |
| 0.6319444444444444 | 333.113 |
| 0.6326388888888889 | 314.98 |
| 0.6333333333333333 | 296.808 |
| 0.6340277777777777 | 278.603 |
| 0.6347222222222222 | 278.603 |
| 0.6354166666666666 | 264.932 |
| 0.6361111111111112 | 251.251 |
| 0.6368055555555555 | 233 |
| 0.6375000000000001 | 219.309 |
| 0.6381944444444444 | 210.182 |
| 0.638888888888889 | 210.182 |
| 0.6395833333333333 | 201.058 |
| 0.6402777777777778 | 191.937 |
| 0.6409722222222222 | 187.378 |
| 0.6416666666666667 | 178.264 |
| 0.642361111111111 | 169.156 |
| 0.6430555555555556 | 164.605 |
| 0.6437499999999999 | 155.509 |
| 0.6444444444444445 | 150.964 |
| 0.6451388888888888 | 141.884 |
| 0.6458333333333334 | 132.814 |
| 0.6465277777777778 | 123.758 |
| 0.6472222222222223 | 114.716 |
| 0.6479166666666667 | 110.201 |
| 0.6486111111111111 | 101.184 |
| 0.6493055555555556 | 92.184 |
| 0.65 | 87.692 |
| 0.6506944444444445 | 83.205 |
| 0.6513888888888889 | 74.246 |
| 0.6520833333333333 | 65.31 |
| 0.6527777777777778 | 60.85 |
| 0.6534722222222222 | 56.398 |
| 0.6541666666666667 | 47.511 |
| 0.6548611111111111 | 38.653 |
| 0.6555555555555556 | 29.823 |
| 0.65625 | 25.419 |
| 0.6569444444444444 | 21.024 |
| 0.6576388888888889 | 21.024 |
| 0.6583333333333333 | 21.024 |
| 0.6590277777777778 | 16.636 |
| 0.6597222222222222 | 16.636 |
| 0.6604166666666667 | 16.636 |
| 0.6611111111111111 | 12.257 |
| 0.6618055555555555 | 12.257 |
| 0.6625 | 12.257 |
| 0.6631944444444444 | 12.257 |
| 0.6638888888888889 | 12.257 |
| 0.6645833333333333 | 7.887 |
| 0.6652777777777777 | 7.887 |
| 0.6659722222222222 | 7.887 |
| 0.6666666666666666 | 7.887 |
| 0.6673611111111111 | 3.525 |
| 0.6680555555555556 | 3.525 |
| 0.6687500000000001 | 3.525 |
| 0.6694444444444444 | 3.525 |
| 0.6701388888888888 | 3.525 |
| 0.6708333333333334 | 3.525 |
| 0.6715277777777778 | 3.525 |
| 0.6722222222222222 | 3.525 |
| 0.6729166666666666 | 0 |
| 0.6736111111111112 | 0 |
| 0.6743055555555556 | 0 |
| 0.6749999999999999 | 0 |
| 0.6756944444444444 | 0 |
| 0.6763888888888889 | 0 |
| 0.6770833333333334 | 0 |
| 0.6777777777777777 | 0 |
| 0.6784722222222223 | 0 |
| 0.6791666666666667 | 0 |
| 0.6798611111111111 | 0 |
| 0.6805555555555555 | 0 |
| 0.68125 | 0 |
| 0.6819444444444445 | 0 |
| 0.6826388888888889 | 0 |
| 0.6833333333333332 | 0 |
| 0.6840277777777778 | 0 |
| 0.6847222222222222 | 0 |
| 0.6854166666666667 | 0 |
| 0.686111111111111 | 0 |
| 0.6868055555555556 | 0 |
| 0.6875 | 0 |
| 0.6881944444444444 | 0 |
| 0.688888888888889 | 0 |
| 0.6895833333333333 | 0 |
| 0.6902777777777778 | 0 |
| 0.6909722222222222 | 0 |
| 0.6916666666666668 | 0 |
| 0.6923611111111111 | 0 |
| 0.6930555555555555 | 0 |
| 0.69375 | 0 |
| 0.6944444444444445 | 0 |
| 0.6951388888888889 | 0 |
| 0.6958333333333333 | 0 |
| 0.6965277777777777 | 0 |
| 0.6972222222222223 | 0 |
| 0.6979166666666666 | 0 |
| 0.6986111111111111 | 0 |
| 0.6993055555555556 | 0 |
| 0.7000000000000001 | 0 |
| 0.7006944444444444 | 0 |
| 0.7013888888888888 | 0 |
| 0.7020833333333334 | 0 |
| 0.7027777777777778 | 0 |
| 0.7034722222222222 | 0 |
| 0.7041666666666666 | 0 |
| 0.7048611111111112 | 0 |
| 0.7055555555555556 | 0 |
| 0.7062499999999999 | 0 |
| 0.7069444444444444 | 0 |
| 0.7076388888888889 | 0 |
| 0.7083333333333334 | 0 |
| 0.7090277777777777 | 0 |
| 0.7097222222222223 | 0 |
| 0.7104166666666667 | 0 |
| 0.7111111111111111 | 0 |
| 0.7118055555555555 | 0 |
| 0.7125 | 0 |
| 0.7131944444444445 | 0 |
| 0.7138888888888889 | 0 |
| 0.7145833333333332 | 0 |
| 0.7152777777777778 | 0 |
| 0.7159722222222222 | 0 |
| 0.7166666666666667 | 0 |
| 0.717361111111111 | 0 |
| 0.7180555555555556 | 0 |
| 0.71875 | 0 |
| 0.7194444444444444 | 0 |
| 0.720138888888889 | 0 |
| 0.7208333333333333 | 0 |
| 0.7215277777777778 | 0 |
| 0.7222222222222222 | 0 |
| 0.7229166666666668 | 0 |
| 0.7236111111111111 | 0 |
| 0.7243055555555555 | 0 |
| 0.725 | 0 |
| 0.7256944444444445 | 0 |
| 0.7263888888888889 | 0 |
| 0.7270833333333333 | 0 |
| 0.7277777777777777 | 0 |
| 0.7284722222222223 | 0 |
| 0.7291666666666666 | 0 |
| 0.7298611111111111 | 0 |
| 0.7305555555555556 | 0 |
| 0.7312500000000001 | 0 |
| 0.7319444444444444 | 0 |
| 0.7326388888888888 | 0 |
| 0.7333333333333334 | 0 |
| 0.7340277777777778 | 0 |
| 0.7347222222222222 | 0 |
| 0.7354166666666666 | 0 |
| 0.7361111111111112 | 0 |
| 0.7368055555555556 | 0 |
| 0.7374999999999999 | 0 |
| 0.7381944444444444 | 0 |
| 0.7388888888888889 | 0 |
| 0.7395833333333334 | 0 |
| 0.7402777777777777 | 0 |
| 0.7409722222222223 | 0 |
| 0.7416666666666667 | 0 |
| 0.7423611111111111 | 0 |
| 0.7430555555555555 | 0 |
| 0.74375 | 0 |
| 0.7444444444444445 | 0 |
| 0.7451388888888889 | 0 |
| 0.7458333333333332 | 0 |
| 0.7465277777777778 | 0 |
| 0.7472222222222222 | 0 |
| 0.7479166666666667 | 0 |
| 0.748611111111111 | 0 |
| 0.7493055555555556 | 0 |
| 0.75 | 0 |
| 0.7506944444444444 | 0 |
| 0.751388888888889 | 0 |
| 0.7520833333333333 | 0 |
| 0.7527777777777778 | 0 |
| 0.7534722222222222 | 0 |
| 0.7541666666666668 | 0 |
| 0.7548611111111111 | 0 |
| 0.7555555555555555 | 0 |
| 0.75625 | 0 |
| 0.7569444444444445 | 0 |
| 0.7576388888888889 | 0 |
| 0.7583333333333333 | 0 |
| 0.7590277777777777 | 0 |
| 0.7597222222222223 | 0 |
| 0.7604166666666666 | 0 |
| 0.7611111111111111 | 0 |
| 0.7618055555555556 | 0 |
| 0.7625000000000001 | 0 |
| 0.7631944444444444 | 0 |
| 0.7638888888888888 | 0 |
| 0.7645833333333334 | 0 |
| 0.7652777777777778 | 0 |
| 0.7659722222222222 | 0 |
| 0.7666666666666666 | 0 |
| 0.7673611111111112 | 0 |
| 0.7680555555555556 | 0 |
| 0.7687499999999999 | 0 |
| 0.7694444444444444 | 0 |
| 0.7701388888888889 | 0 |
| 0.7708333333333334 | 0 |
| 0.7715277777777777 | 0 |
| 0.7722222222222223 | 0 |
| 0.7729166666666667 | 0 |
| 0.7736111111111111 | 0 |
| 0.7743055555555555 | 0 |
| 0.775 | 0 |
| 0.7756944444444445 | 0 |
| 0.7763888888888889 | 0 |
| 0.7770833333333332 | 0 |
| 0.7777777777777778 | 0 |
| 0.7784722222222222 | 0 |
| 0.7791666666666667 | 0 |
| 0.779861111111111 | 0 |
| 0.7805555555555556 | 0 |
| 0.78125 | 0 |
| 0.7819444444444444 | 0 |
| 0.782638888888889 | 0 |
| 0.7833333333333333 | 0 |
| 0.7840277777777778 | 0 |
| 0.7847222222222222 | 0 |
| 0.7854166666666668 | 0 |
| 0.7861111111111111 | 0 |
| 0.7868055555555555 | 0 |
| 0.7875 | 0 |
| 0.7881944444444445 | 0 |
| 0.7888888888888889 | 0 |
| 0.7895833333333333 | 0 |
| 0.7902777777777777 | 0 |
| 0.7909722222222223 | 0 |
| 0.7916666666666666 | 0 |
| 0.7923611111111111 | 0 |
| 0.7930555555555556 | 0 |
| 0.7937500000000001 | 0 |
| 0.7944444444444444 | 0 |
| 0.7951388888888888 | 0 |
| 0.7958333333333334 | 0 |
| 0.7965277777777778 | 0 |
| 0.7972222222222222 | 0 |
| 0.7979166666666666 | 0 |
| 0.7986111111111112 | 0 |
| 0.7993055555555556 | 0 |
| 0.7999999999999999 | 0 |
| 0.8006944444444444 | 0 |
| 0.8013888888888889 | 0 |
| 0.8020833333333334 | 0 |
| 0.8027777777777777 | 0 |
| 0.8034722222222223 | 0 |
| 0.8041666666666667 | 0 |
| 0.8048611111111111 | 0 |
| 0.8055555555555555 | 0 |
| 0.80625 | 0 |
| 0.8069444444444445 | 0 |
| 0.8076388888888889 | 0 |
| 0.8083333333333332 | 0 |
| 0.8090277777777778 | 0 |
| 0.8097222222222222 | 0 |
| 0.8104166666666667 | 0 |
| 0.811111111111111 | 0 |
| 0.8118055555555556 | 0 |
| 0.8125 | 0 |
| 0.8131944444444444 | 0 |
| 0.813888888888889 | 0 |
| 0.8145833333333333 | 0 |
| 0.8152777777777778 | 0 |
| 0.8159722222222222 | 0 |
| 0.8166666666666668 | 0 |
| 0.8173611111111111 | 0 |
| 0.8180555555555555 | 0 |
| 0.81875 | 0 |
| 0.8194444444444445 | 0 |
| 0.8201388888888889 | 0 |
| 0.8208333333333333 | 0 |
| 0.8215277777777777 | 0 |
| 0.8222222222222223 | 0 |
| 0.8229166666666666 | 0 |
| 0.8236111111111111 | 0 |
| 0.8243055555555556 | 0 |
| 0.8250000000000001 | 0 |
| 0.8256944444444444 | 0 |
| 0.8263888888888888 | 0 |
| 0.8270833333333334 | 0 |
| 0.8277777777777778 | 0 |
| 0.8284722222222222 | 0 |
| 0.8291666666666666 | 0 |
| 0.8298611111111112 | 0 |
| 0.8305555555555556 | 0 |
| 0.8312499999999999 | 0 |
| 0.8319444444444444 | 0 |
| 0.8326388888888889 | 0 |
| 0.8333333333333334 | 0 |
| 0.8340277777777777 | 0 |
| 0.8347222222222223 | 0 |
| 0.8354166666666667 | 0 |
| 0.8361111111111111 | 0 |
| 0.8368055555555555 | 0 |
| 0.8375 | 0 |
| 0.8381944444444445 | 0 |
| 0.8388888888888889 | 0 |
| 0.8395833333333332 | 0 |
| 0.8402777777777778 | 0 |
| 0.8409722222222222 | 0 |
| 0.8416666666666667 | 0 |
| 0.842361111111111 | 0 |
| 0.8430555555555556 | 0 |
| 0.84375 | 0 |
| 0.8444444444444444 | 0 |
| 0.845138888888889 | 0 |
| 0.8458333333333333 | 0 |
| 0.8465277777777778 | 0 |
| 0.8472222222222222 | 0 |
| 0.8479166666666668 | 0 |
| 0.8486111111111111 | 0 |
| 0.8493055555555555 | 0 |
| 0.85 | 0 |
| 0.8506944444444445 | 0 |
| 0.8513888888888889 | 0 |
| 0.8520833333333333 | 0 |
| 0.8527777777777777 | 0 |
| 0.8534722222222223 | 0 |
| 0.8541666666666666 | 0 |
| 0.8548611111111111 | 0 |
| 0.8555555555555556 | 0 |
| 0.8562500000000001 | 0 |
| 0.8569444444444444 | 0 |
| 0.8576388888888888 | 0 |
| 0.8583333333333334 | 0 |
| 0.8590277777777778 | 0 |
| 0.8597222222222222 | 0 |
| 0.8604166666666666 | 0 |
| 0.8611111111111112 | 0 |
| 0.8618055555555556 | 0 |
| 0.8624999999999999 | 0 |
| 0.8631944444444444 | 0 |
| 0.8638888888888889 | 0 |
| 0.8645833333333334 | 0 |
| 0.8652777777777777 | 0 |
| 0.8659722222222223 | 0 |
| 0.8666666666666667 | 0 |
| 0.8673611111111111 | 0 |
| 0.8680555555555555 | 0 |
| 0.86875 | 0 |
| 0.8694444444444445 | 0 |
| 0.8701388888888889 | 0 |
| 0.8708333333333332 | 0 |
| 0.8715277777777778 | 0 |
| 0.8722222222222222 | 0 |
| 0.8729166666666667 | 0 |
| 0.873611111111111 | 0 |
| 0.8743055555555556 | 0 |
| 0.875 | 0 |
| 0.8756944444444444 | 0 |
| 0.876388888888889 | 0 |
| 0.8770833333333333 | 0 |
| 0.8777777777777778 | 0 |
| 0.8784722222222222 | 0 |
| 0.8791666666666668 | 0 |
| 0.8798611111111111 | 0 |
| 0.8805555555555555 | 0 |
| 0.88125 | 0 |
| 0.8819444444444445 | 0 |
| 0.8826388888888889 | 0 |
| 0.8833333333333333 | 0 |
| 0.8840277777777777 | 0 |
| 0.8847222222222223 | 0 |
| 0.8854166666666666 | 0 |
| 0.8861111111111111 | 0 |
| 0.8868055555555556 | 0 |
| 0.8875000000000001 | 0 |
| 0.8881944444444444 | 0 |
| 0.8888888888888888 | 0 |
| 0.8895833333333334 | 0 |
| 0.8902777777777778 | 0 |
| 0.8909722222222222 | 0 |
| 0.8916666666666666 | 0 |
| 0.8923611111111112 | 0 |
| 0.8930555555555556 | 0 |
| 0.8937499999999999 | 0 |
| 0.8944444444444444 | 0 |
| 0.8951388888888889 | 0 |
| 0.8958333333333334 | 0 |
| 0.8965277777777777 | 0 |
| 0.8972222222222223 | 0 |
| 0.8979166666666667 | 0 |
| 0.8986111111111111 | 0 |
| 0.8993055555555555 | 0 |
| 0.9 | 0 |
| 0.9006944444444445 | 0 |
| 0.9013888888888889 | 0 |
| 0.9020833333333332 | 0 |
| 0.9027777777777778 | 0 |
| 0.9034722222222222 | 0 |
| 0.9041666666666667 | 0 |
| 0.904861111111111 | 0 |
| 0.9055555555555556 | 0 |
| 0.90625 | 0 |
| 0.9069444444444444 | 0 |
| 0.907638888888889 | 0 |
| 0.9083333333333333 | 0 |
| 0.9090277777777778 | 0 |
| 0.9097222222222222 | 0 |
| 0.9104166666666668 | 0 |
| 0.9111111111111111 | 0 |
| 0.9118055555555555 | 0 |
| 0.9125 | 0 |
| 0.9131944444444445 | 0 |
| 0.9138888888888889 | 0 |
| 0.9145833333333333 | 0 |
| 0.9152777777777777 | 0 |
| 0.9159722222222223 | 0 |
| 0.9166666666666666 | 0 |
| 0.9173611111111111 | 0 |
| 0.9180555555555556 | 0 |
| 0.9187500000000001 | 0 |
| 0.9194444444444444 | 0 |
| 0.9201388888888888 | 0 |
| 0.9208333333333334 | 0 |
| 0.9215277777777778 | 0 |
| 0.9222222222222222 | 0 |
| 0.9229166666666666 | 0 |
| 0.9236111111111112 | 0 |
| 0.9243055555555556 | 0 |
| 0.9249999999999999 | 0 |
| 0.9256944444444444 | 0 |
| 0.9263888888888889 | 0 |
| 0.9270833333333334 | 0 |
| 0.9277777777777777 | 0 |
| 0.9284722222222223 | 0 |
| 0.9291666666666667 | 0 |
| 0.9298611111111111 | 0 |
| 0.9305555555555555 | 0 |
| 0.93125 | 0 |
| 0.9319444444444445 | 0 |
| 0.9326388888888889 | 0 |
| 0.9333333333333332 | 0 |
| 0.9340277777777778 | 0 |
| 0.9347222222222222 | 0 |
| 0.9354166666666667 | 0 |
| 0.936111111111111 | 0 |
| 0.9368055555555556 | 0 |
| 0.9375 | 0 |
| 0.9381944444444444 | 0 |
| 0.938888888888889 | 0 |
| 0.9395833333333333 | 0 |
| 0.9402777777777778 | 0 |
| 0.9409722222222222 | 0 |
| 0.9416666666666668 | 0 |
| 0.9423611111111111 | 0 |
| 0.9430555555555555 | 0 |
| 0.94375 | 0 |
| 0.9444444444444445 | 0 |
| 0.9451388888888889 | 0 |
| 0.9458333333333333 | 0 |
| 0.9465277777777777 | 0 |
| 0.9472222222222223 | 0 |
| 0.9479166666666666 | 0 |
| 0.9486111111111111 | 0 |
| 0.9493055555555556 | 0 |
| 0.9500000000000001 | 0 |
| 0.9506944444444444 | 0 |
| 0.9513888888888888 | 0 |
| 0.9520833333333334 | 0 |
| 0.9527777777777778 | 0 |
| 0.9534722222222222 | 0 |
| 0.9541666666666666 | 0 |
| 0.9548611111111112 | 0 |
| 0.9555555555555556 | 0 |
| 0.9562499999999999 | 0 |
| 0.9569444444444444 | 0 |
| 0.9576388888888889 | 0 |
| 0.9583333333333334 | 0 |
| 0.9590277777777777 | 0 |
| 0.9597222222222223 | 0 |
| 0.9604166666666667 | 0 |
| 0.9611111111111111 | 0 |
| 0.9618055555555555 | 0 |
| 0.9625 | 0 |
| 0.9631944444444445 | 0 |
| 0.9638888888888889 | 0 |
| 0.9645833333333332 | 0 |
| 0.9652777777777778 | 0 |
| 0.9659722222222222 | 0 |
| 0.9666666666666667 | 0 |
| 0.967361111111111 | 0 |
| 0.9680555555555556 | 0 |
| 0.96875 | 0 |
| 0.9694444444444444 | 0 |
| 0.970138888888889 | 0 |
| 0.9708333333333333 | 0 |
| 0.9715277777777778 | 0 |
| 0.9722222222222222 | 0 |
| 0.9729166666666668 | 0 |
| 0.9736111111111111 | 0 |
| 0.9743055555555555 | 0 |
| 0.975 | 0 |
| 0.9756944444444445 | 0 |
| 0.9763888888888889 | 0 |
| 0.9770833333333333 | 0 |
| 0.9777777777777777 | 0 |
| 0.9784722222222223 | 0 |
| 0.9791666666666666 | 0 |
| 0.9798611111111111 | 0 |
| 0.9805555555555556 | 0 |
| 0.9812500000000001 | 0 |
| 0.9819444444444444 | 0 |
| 0.9826388888888888 | 0 |
| 0.9833333333333334 | 0 |
| 0.9840277777777778 | 0 |
| 0.9847222222222222 | 0 |
| 0.9854166666666666 | 0 |
| 0.9861111111111112 | 0 |
| 0.9868055555555556 | 0 |
| 0.9874999999999999 | 0 |
| 0.9881944444444444 | 0 |
| 0.9888888888888889 | 0 |
| 0.9895833333333334 | 0 |
| 0.9902777777777777 | 0 |
| 0.9909722222222223 | 0 |
| 0.9916666666666667 | 0 |
| 0.9923611111111111 | 0 |
| 0.9930555555555555 | 0 |
| 0.99375 | 0 |
| 0.9944444444444445 | 0 |
| 0.9951388888888889 | 0 |
| 0.9958333333333332 | 0 |
| 0.9965277777777778 | 0 |
| 0.9972222222222222 | 0 |
| 0.9979166666666667 | 0 |
| 0.998611111111111 | 0 |
| 0.9993055555555556 | 0 |